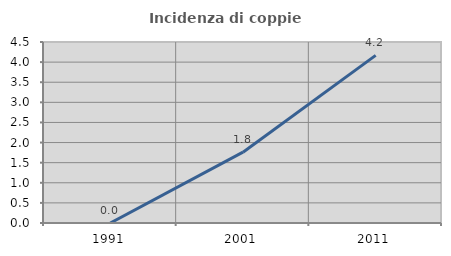
| Category | Incidenza di coppie miste |
|---|---|
| 1991.0 | 0 |
| 2001.0 | 1.761 |
| 2011.0 | 4.167 |